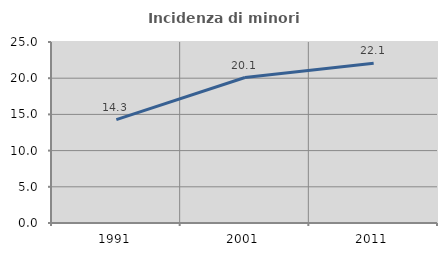
| Category | Incidenza di minori stranieri |
|---|---|
| 1991.0 | 14.286 |
| 2001.0 | 20.093 |
| 2011.0 | 22.051 |